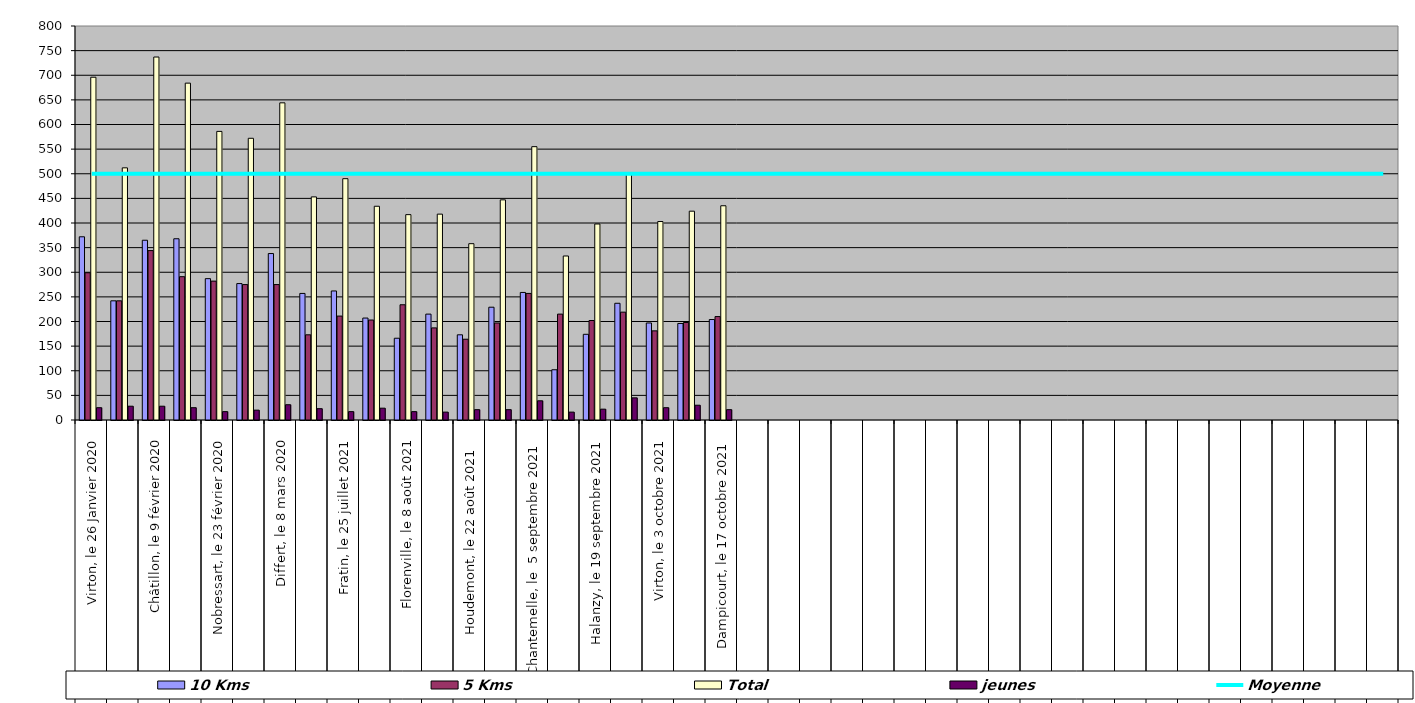
| Category | 10 Kms | 5 Kms | Total | jeunes |
|---|---|---|---|---|
| 0 | 372 | 299 | 696 | 25 |
| 1 | 242 | 242 | 512 | 28 |
| 2 | 365 | 344 | 737 | 28 |
| 3 | 368 | 291 | 684 | 25 |
| 4 | 287 | 282 | 586 | 17 |
| 5 | 277 | 275 | 572 | 20 |
| 6 | 338 | 275 | 644 | 31 |
| 7 | 257 | 173 | 453 | 23 |
| 8 | 262 | 211 | 490 | 17 |
| 9 | 207 | 203 | 434 | 24 |
| 10 | 166 | 234 | 417 | 17 |
| 11 | 215 | 187 | 418 | 16 |
| 12 | 173 | 164 | 358 | 21 |
| 13 | 229 | 197 | 447 | 21 |
| 14 | 259 | 257 | 555 | 39 |
| 15 | 102 | 215 | 333 | 16 |
| 16 | 174 | 202 | 398 | 22 |
| 17 | 237 | 219 | 501 | 45 |
| 18 | 197 | 181 | 403 | 25 |
| 19 | 196 | 198 | 424 | 30 |
| 20 | 204 | 210 | 435 | 21 |
| 21 | 0 | 0 | 0 | 0 |
| 22 | 0 | 0 | 0 | 0 |
| 23 | 0 | 0 | 0 | 0 |
| 24 | 0 | 0 | 0 | 0 |
| 25 | 0 | 0 | 0 | 0 |
| 26 | 0 | 0 | 0 | 0 |
| 27 | 0 | 0 | 0 | 0 |
| 28 | 0 | 0 | 0 | 0 |
| 29 | 0 | 0 | 0 | 0 |
| 30 | 0 | 0 | 0 | 0 |
| 31 | 0 | 0 | 0 | 0 |
| 32 | 0 | 0 | 0 | 0 |
| 33 | 0 | 0 | 0 | 0 |
| 34 | 0 | 0 | 0 | 0 |
| 35 | 0 | 0 | 0 | 0 |
| 36 | 0 | 0 | 0 | 0 |
| 37 | 0 | 0 | 0 | 0 |
| 38 | 0 | 0 | 0 | 0 |
| 39 | 0 | 0 | 0 | 0 |
| 40 | 0 | 0 | 0 | 0 |
| 41 | 0 | 0 | 0 | 0 |